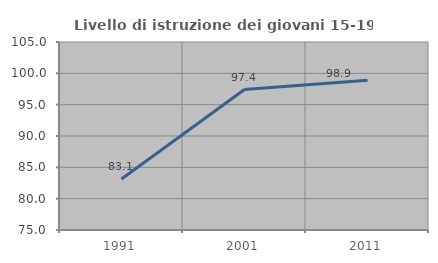
| Category | Livello di istruzione dei giovani 15-19 anni |
|---|---|
| 1991.0 | 83.128 |
| 2001.0 | 97.417 |
| 2011.0 | 98.893 |